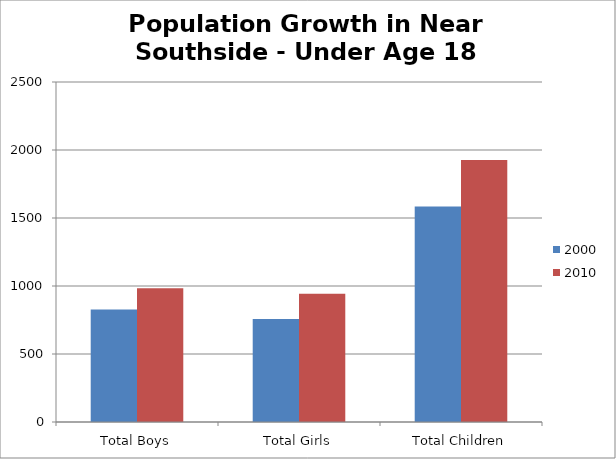
| Category | 2000 | 2010 |
|---|---|---|
| Total Boys | 828 | 983 |
| Total Girls | 757 | 943 |
| Total Children | 1585 | 1926 |